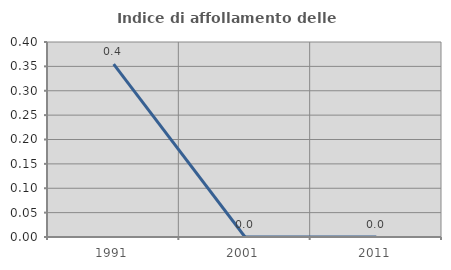
| Category | Indice di affollamento delle abitazioni  |
|---|---|
| 1991.0 | 0.355 |
| 2001.0 | 0 |
| 2011.0 | 0 |